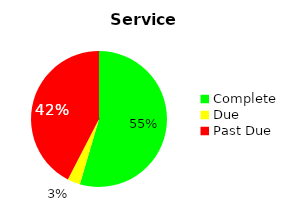
| Category | Series 0 |
|---|---|
| Complete | 18 |
| Due | 1 |
| Past Due | 14 |